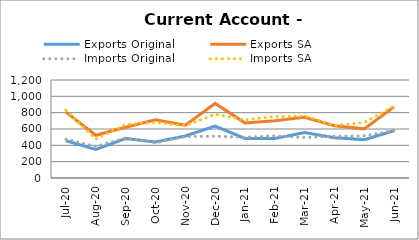
| Category | Exports Original | Exports SA | Imports Original | Imports SA |
|---|---|---|---|---|
| 2020-07-11 | 456 | 807 | 476 | 829 |
| 2020-08-11 | 350 | 523 | 386 | 477 |
| 2020-09-11 | 483 | 622 | 492 | 654 |
| 2020-10-11 | 440 | 714 | 429 | 681 |
| 2020-11-11 | 514 | 647 | 507 | 641 |
| 2020-12-11 | 636 | 913 | 512 | 780 |
| 2021-01-11 | 484 | 675 | 499 | 712 |
| 2021-02-11 | 485 | 702 | 516 | 752 |
| 2021-03-11 | 556 | 744 | 496 | 760 |
| 2021-04-11 | 493 | 641 | 511 | 642 |
| 2021-05-11 | 470 | 602 | 516 | 680 |
| 2021-06-11 | 578 | 871 | 583 | 880 |